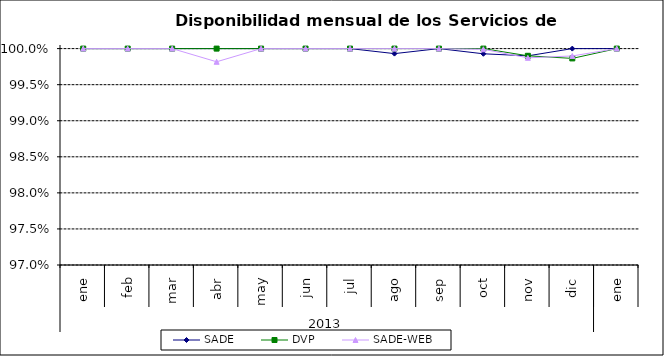
| Category | SADE | DVP | SADE-WEB |
|---|---|---|---|
| 0 | 1 | 1 | 1 |
| 1 | 1 | 1 | 1 |
| 2 | 1 | 1 | 1 |
| 3 | 1 | 1 | 0.998 |
| 4 | 1 | 1 | 1 |
| 5 | 1 | 1 | 1 |
| 6 | 1 | 1 | 1 |
| 7 | 0.999 | 1 | 1 |
| 8 | 1 | 1 | 1 |
| 9 | 0.999 | 1 | 1 |
| 10 | 0.999 | 0.999 | 0.999 |
| 11 | 1 | 0.999 | 0.999 |
| 12 | 1 | 1 | 1 |